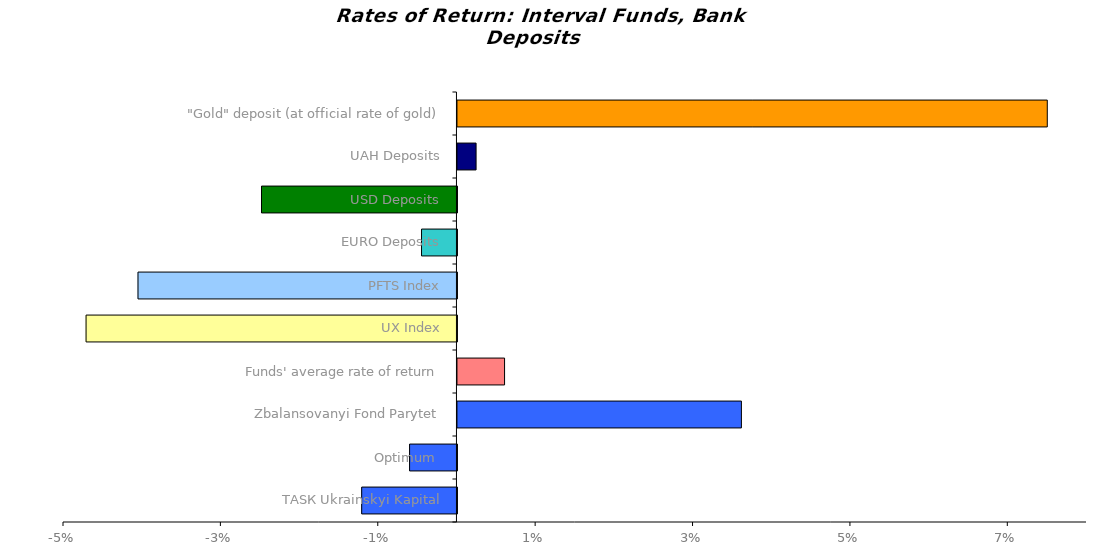
| Category | Series 0 |
|---|---|
| ТАSК Ukrainskyi Kapital | -0.012 |
| Optimum  | -0.006 |
| Zbalansovanyi Fond Parytet | 0.036 |
| Funds' average rate of return | 0.006 |
| UX Index | -0.047 |
| PFTS Index | -0.041 |
| EURO Deposits | -0.005 |
| USD Deposits | -0.025 |
| UAH Deposits | 0.002 |
| "Gold" deposit (at official rate of gold) | 0.075 |